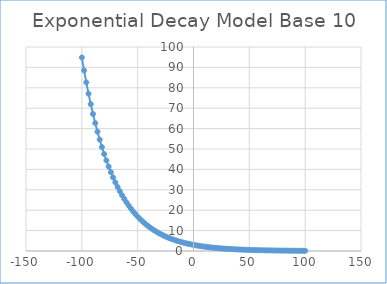
| Category | Series 0 |
|---|---|
| -100.0 | 94.868 |
| -98.0 | 88.536 |
| -96.0 | 82.627 |
| -94.0 | 77.112 |
| -92.0 | 71.965 |
| -90.0 | 67.162 |
| -88.0 | 62.679 |
| -86.0 | 58.495 |
| -84.0 | 54.591 |
| -82.0 | 50.947 |
| -80.0 | 47.547 |
| -78.0 | 44.373 |
| -76.0 | 41.412 |
| -74.0 | 38.647 |
| -72.0 | 36.068 |
| -70.0 | 33.661 |
| -68.0 | 31.414 |
| -66.0 | 29.317 |
| -64.0 | 27.36 |
| -62.0 | 25.534 |
| -60.0 | 23.83 |
| -58.0 | 22.239 |
| -56.0 | 20.755 |
| -54.0 | 19.37 |
| -52.0 | 18.077 |
| -50.0 | 16.87 |
| -48.0 | 15.744 |
| -46.0 | 14.693 |
| -44.0 | 13.713 |
| -42.0 | 12.797 |
| -40.0 | 11.943 |
| -38.0 | 11.146 |
| -36.0 | 10.402 |
| -34.0 | 9.708 |
| -32.0 | 9.06 |
| -30.0 | 8.455 |
| -28.0 | 7.891 |
| -26.0 | 7.364 |
| -24.0 | 6.873 |
| -22.0 | 6.414 |
| -20.0 | 5.986 |
| -18.0 | 5.586 |
| -16.0 | 5.213 |
| -14.0 | 4.865 |
| -12.0 | 4.541 |
| -10.0 | 4.238 |
| -8.0 | 3.955 |
| -6.0 | 3.691 |
| -4.0 | 3.444 |
| -2.0 | 3.215 |
| 0.0 | 3 |
| 2.0 | 2.8 |
| 4.0 | 2.613 |
| 6.0 | 2.438 |
| 8.0 | 2.276 |
| 10.0 | 2.124 |
| 12.0 | 1.982 |
| 14.0 | 1.85 |
| 16.0 | 1.726 |
| 18.0 | 1.611 |
| 20.0 | 1.504 |
| 22.0 | 1.403 |
| 24.0 | 1.31 |
| 26.0 | 1.222 |
| 28.0 | 1.141 |
| 30.0 | 1.064 |
| 32.0 | 0.993 |
| 34.0 | 0.927 |
| 36.0 | 0.865 |
| 38.0 | 0.807 |
| 40.0 | 0.754 |
| 42.0 | 0.703 |
| 44.0 | 0.656 |
| 46.0 | 0.613 |
| 48.0 | 0.572 |
| 50.0 | 0.533 |
| 52.0 | 0.498 |
| 54.0 | 0.465 |
| 56.0 | 0.434 |
| 58.0 | 0.405 |
| 60.0 | 0.378 |
| 62.0 | 0.352 |
| 64.0 | 0.329 |
| 66.0 | 0.307 |
| 68.0 | 0.286 |
| 70.0 | 0.267 |
| 72.0 | 0.25 |
| 74.0 | 0.233 |
| 76.0 | 0.217 |
| 78.0 | 0.203 |
| 80.0 | 0.189 |
| 82.0 | 0.177 |
| 84.0 | 0.165 |
| 86.0 | 0.154 |
| 88.0 | 0.144 |
| 90.0 | 0.134 |
| 92.0 | 0.125 |
| 94.0 | 0.117 |
| 96.0 | 0.109 |
| 98.0 | 0.102 |
| 100.0 | 0.095 |